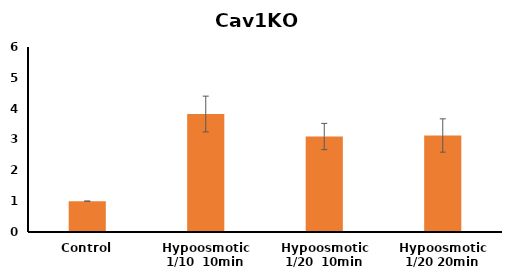
| Category | Cav1KO MEFs |
|---|---|
| Control | 1 |
| Hypoosmotic 1/10  10min | 3.827 |
| Hypoosmotic 1/20  10min | 3.097 |
| Hypoosmotic 1/20 20min | 3.13 |